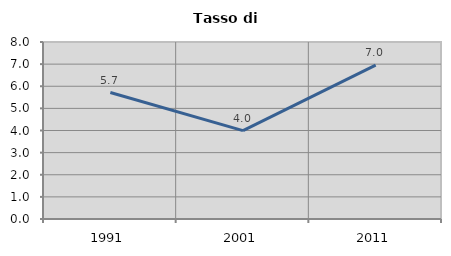
| Category | Tasso di disoccupazione   |
|---|---|
| 1991.0 | 5.717 |
| 2001.0 | 3.995 |
| 2011.0 | 6.951 |